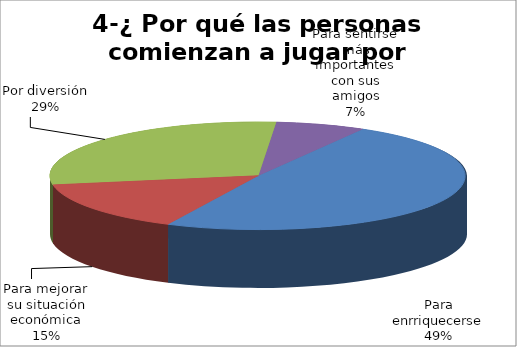
| Category | Series 0 |
|---|---|
| Para enrriquecerse | 161 |
| Para mejorar su situación económica | 50 |
| Por diversión | 96 |
| Para sentirse más importantes con sus amigos | 23 |